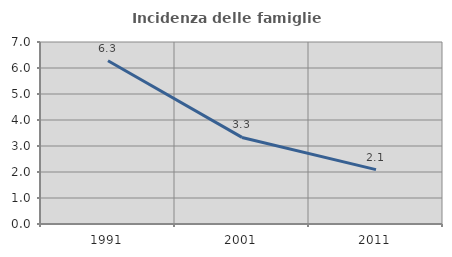
| Category | Incidenza delle famiglie numerose |
|---|---|
| 1991.0 | 6.28 |
| 2001.0 | 3.33 |
| 2011.0 | 2.09 |